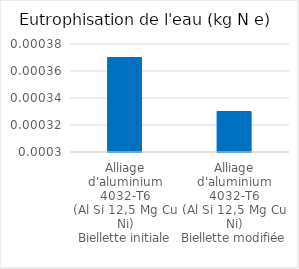
| Category | Series 0 |
|---|---|
| Alliage
d'aluminium
4032-T6
(Al Si 12,5 Mg Cu Ni)
Biellette initiale | 0 |
| Alliage
d'aluminium
4032-T6
(Al Si 12,5 Mg Cu Ni)
Biellette modifiée | 0 |